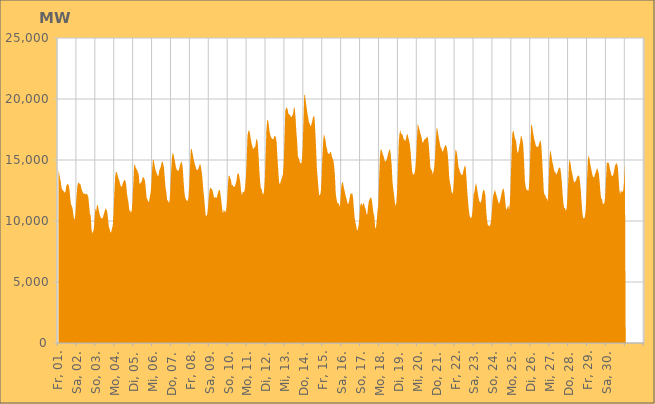
| Category | Series 0 |
|---|---|
|  Fr, 01.  | 14206.051 |
|  Fr, 01.  | 13898.54 |
|  Fr, 01.  | 13524.596 |
|  Fr, 01.  | 13199.623 |
|  Fr, 01.  | 12732.228 |
|  Fr, 01.  | 12575.21 |
|  Fr, 01.  | 12479.958 |
|  Fr, 01.  | 12425.705 |
|  Fr, 01.  | 12317.942 |
|  Fr, 01.  | 12392.595 |
|  Fr, 01.  | 12840.652 |
|  Fr, 01.  | 13028.688 |
|  Fr, 01.  | 13005.393 |
|  Fr, 01.  | 12953.041 |
|  Fr, 01.  | 12615.643 |
|  Fr, 01.  | 11912.754 |
|  Fr, 01.  | 11335.12 |
|  Sa, 02.  | 11243.42 |
|  Sa, 02.  | 11025.664 |
|  Sa, 02.  | 10510.777 |
|  Sa, 02.  | 10113.72 |
|  Sa, 02.  | 10259.37 |
|  Sa, 02.  | 10952.562 |
|  Sa, 02.  | 12005.603 |
|  Sa, 02.  | 12832.21 |
|  Sa, 02.  | 13135.107 |
|  Sa, 02.  | 13150.794 |
|  Sa, 02.  | 13036.995 |
|  Sa, 02.  | 13015.672 |
|  Sa, 02.  | 12733.287 |
|  Sa, 02.  | 12494.398 |
|  Sa, 02.  | 12358.996 |
|  Sa, 02.  | 12226.408 |
|  Sa, 02.  | 12256.556 |
|  Sa, 02.  | 12180.439 |
|  Sa, 02.  | 12204.571 |
|  Sa, 02.  | 12257.152 |
|  Sa, 02.  | 12134.843 |
|  Sa, 02.  | 11950.709 |
|  Sa, 02.  | 11250.667 |
|  Sa, 02.  | 10595.837 |
|  So, 03.  | 10470.053 |
|  So, 03.  | 9328.382 |
|  So, 03.  | 8987.927 |
|  So, 03.  | 9121.21 |
|  So, 03.  | 9351.886 |
|  So, 03.  | 10251.27 |
|  So, 03.  | 11045.456 |
|  So, 03.  | 10779.096 |
|  So, 03.  | 11344.207 |
|  So, 03.  | 11270.086 |
|  So, 03.  | 10972.944 |
|  So, 03.  | 10637.859 |
|  So, 03.  | 10394.919 |
|  So, 03.  | 10248.529 |
|  So, 03.  | 10213.805 |
|  So, 03.  | 10219.402 |
|  So, 03.  | 10424.769 |
|  So, 03.  | 10634.33 |
|  So, 03.  | 10867.056 |
|  So, 03.  | 11042.839 |
|  So, 03.  | 10928.629 |
|  So, 03.  | 10762.635 |
|  So, 03.  | 10172.294 |
|  So, 03.  | 9533.628 |
|  Mo, 04.  | 9350.665 |
|  Mo, 04.  | 9080.947 |
|  Mo, 04.  | 9078.856 |
|  Mo, 04.  | 9410.664 |
|  Mo, 04.  | 9592.637 |
|  Mo, 04.  | 10638.851 |
|  Mo, 04.  | 12307.908 |
|  Mo, 04.  | 13552.523 |
|  Mo, 04.  | 14026.66 |
|  Mo, 04.  | 14020.889 |
|  Mo, 04.  | 13797.84 |
|  Mo, 04.  | 13517.506 |
|  Mo, 04.  | 13401.262 |
|  Mo, 04.  | 13107.609 |
|  Mo, 04.  | 12873.319 |
|  Mo, 04.  | 12814.643 |
|  Mo, 04.  | 12889.637 |
|  Mo, 04.  | 13191.631 |
|  Mo, 04.  | 13248.834 |
|  Mo, 04.  | 13364.007 |
|  Mo, 04.  | 13331.704 |
|  Mo, 04.  | 12995.231 |
|  Mo, 04.  | 12264.385 |
|  Mo, 04.  | 11835.309 |
|  Di, 05.  | 11487.394 |
|  Di, 05.  | 10874.551 |
|  Di, 05.  | 10864.825 |
|  Di, 05.  | 10688.755 |
|  Di, 05.  | 10825.414 |
|  Di, 05.  | 11600.363 |
|  Di, 05.  | 12907.909 |
|  Di, 05.  | 14474.789 |
|  Di, 05.  | 14675.454 |
|  Di, 05.  | 14391.939 |
|  Di, 05.  | 14252.791 |
|  Di, 05.  | 14185.047 |
|  Di, 05.  | 13947.563 |
|  Di, 05.  | 13836.455 |
|  Di, 05.  | 13027.003 |
|  Di, 05.  | 13094.088 |
|  Di, 05.  | 13162.027 |
|  Di, 05.  | 13322.48 |
|  Di, 05.  | 13561.113 |
|  Di, 05.  | 13606.327 |
|  Di, 05.  | 13472.17 |
|  Di, 05.  | 13273.701 |
|  Di, 05.  | 12561.321 |
|  Di, 05.  | 11909.867 |
|  Mi, 06.  | 11768.25 |
|  Mi, 06.  | 11576.035 |
|  Mi, 06.  | 11589.949 |
|  Mi, 06.  | 11956.907 |
|  Mi, 06.  | 12294.291 |
|  Mi, 06.  | 13074.343 |
|  Mi, 06.  | 14232.596 |
|  Mi, 06.  | 15055.646 |
|  Mi, 06.  | 14973.45 |
|  Mi, 06.  | 14584.961 |
|  Mi, 06.  | 14257.167 |
|  Mi, 06.  | 14042.216 |
|  Mi, 06.  | 13870.75 |
|  Mi, 06.  | 13701.636 |
|  Mi, 06.  | 13702.376 |
|  Mi, 06.  | 14144.88 |
|  Mi, 06.  | 14287.904 |
|  Mi, 06.  | 14451.086 |
|  Mi, 06.  | 14784.713 |
|  Mi, 06.  | 14895.878 |
|  Mi, 06.  | 14687.911 |
|  Mi, 06.  | 14373.372 |
|  Mi, 06.  | 13541.577 |
|  Mi, 06.  | 12740.655 |
|  Do, 07.  | 12383.187 |
|  Do, 07.  | 11676.686 |
|  Do, 07.  | 11714.906 |
|  Do, 07.  | 11489.28 |
|  Do, 07.  | 11573.614 |
|  Do, 07.  | 12477.417 |
|  Do, 07.  | 13890.114 |
|  Do, 07.  | 15122.87 |
|  Do, 07.  | 15595.339 |
|  Do, 07.  | 15476.857 |
|  Do, 07.  | 15157.253 |
|  Do, 07.  | 14859.736 |
|  Do, 07.  | 14452.036 |
|  Do, 07.  | 14225.45 |
|  Do, 07.  | 14143.567 |
|  Do, 07.  | 14140.405 |
|  Do, 07.  | 14165.702 |
|  Do, 07.  | 14482.812 |
|  Do, 07.  | 14680.517 |
|  Do, 07.  | 14893.882 |
|  Do, 07.  | 14719.253 |
|  Do, 07.  | 14183.542 |
|  Do, 07.  | 13138.059 |
|  Do, 07.  | 12300.085 |
|  Fr, 08.  | 11913.491 |
|  Fr, 08.  | 11748.238 |
|  Fr, 08.  | 11670.884 |
|  Fr, 08.  | 11632.396 |
|  Fr, 08.  | 11896.291 |
|  Fr, 08.  | 12812.306 |
|  Fr, 08.  | 14328.753 |
|  Fr, 08.  | 15818.422 |
|  Fr, 08.  | 15954.343 |
|  Fr, 08.  | 15625.807 |
|  Fr, 08.  | 15268.075 |
|  Fr, 08.  | 14989.449 |
|  Fr, 08.  | 14680.382 |
|  Fr, 08.  | 14492.148 |
|  Fr, 08.  | 14233.564 |
|  Fr, 08.  | 14185.385 |
|  Fr, 08.  | 14194.205 |
|  Fr, 08.  | 14367.099 |
|  Fr, 08.  | 14578.973 |
|  Fr, 08.  | 14695.78 |
|  Fr, 08.  | 14383.202 |
|  Fr, 08.  | 13996.387 |
|  Fr, 08.  | 13352.292 |
|  Fr, 08.  | 12469.064 |
|  Sa, 09.  | 11889.752 |
|  Sa, 09.  | 11133.941 |
|  Sa, 09.  | 10399.812 |
|  Sa, 09.  | 10425.381 |
|  Sa, 09.  | 10563.251 |
|  Sa, 09.  | 11219.383 |
|  Sa, 09.  | 12026.362 |
|  Sa, 09.  | 12565.53 |
|  Sa, 09.  | 12745.648 |
|  Sa, 09.  | 12654.006 |
|  Sa, 09.  | 12609.409 |
|  Sa, 09.  | 12396.417 |
|  Sa, 09.  | 12074.853 |
|  Sa, 09.  | 11879.501 |
|  Sa, 09.  | 11942.247 |
|  Sa, 09.  | 11921.655 |
|  Sa, 09.  | 11899.793 |
|  Sa, 09.  | 12196.129 |
|  Sa, 09.  | 12410.26 |
|  Sa, 09.  | 12536.572 |
|  Sa, 09.  | 12521.517 |
|  Sa, 09.  | 12050.539 |
|  Sa, 09.  | 11522.445 |
|  Sa, 09.  | 10857.208 |
|  So, 10.  | 10633.791 |
|  So, 10.  | 10960.236 |
|  So, 10.  | 10768.791 |
|  So, 10.  | 10743.495 |
|  So, 10.  | 10908.038 |
|  So, 10.  | 11624.675 |
|  So, 10.  | 12783.029 |
|  So, 10.  | 13671.524 |
|  So, 10.  | 13732.509 |
|  So, 10.  | 13521.214 |
|  So, 10.  | 13350.705 |
|  So, 10.  | 12912.219 |
|  So, 10.  | 12962.944 |
|  So, 10.  | 12842.856 |
|  So, 10.  | 12777.029 |
|  So, 10.  | 12850.332 |
|  So, 10.  | 13040.249 |
|  So, 10.  | 13324.922 |
|  So, 10.  | 13793.408 |
|  So, 10.  | 13913.025 |
|  So, 10.  | 13871.282 |
|  So, 10.  | 13503.177 |
|  So, 10.  | 13053.056 |
|  So, 10.  | 12385.698 |
|  Mo, 11.  | 12098.429 |
|  Mo, 11.  | 12435.155 |
|  Mo, 11.  | 12357.357 |
|  Mo, 11.  | 12424.213 |
|  Mo, 11.  | 12817.484 |
|  Mo, 11.  | 13599.244 |
|  Mo, 11.  | 15116.304 |
|  Mo, 11.  | 16978.296 |
|  Mo, 11.  | 17358.862 |
|  Mo, 11.  | 17437.573 |
|  Mo, 11.  | 17205.193 |
|  Mo, 11.  | 16787.847 |
|  Mo, 11.  | 16403.98 |
|  Mo, 11.  | 16170.717 |
|  Mo, 11.  | 15904.078 |
|  Mo, 11.  | 15944.777 |
|  Mo, 11.  | 16057.05 |
|  Mo, 11.  | 16125.807 |
|  Mo, 11.  | 16631.586 |
|  Mo, 11.  | 16742.349 |
|  Mo, 11.  | 16415.961 |
|  Mo, 11.  | 15412.886 |
|  Mo, 11.  | 14183.733 |
|  Mo, 11.  | 13206.851 |
|  Di, 12.  | 12649.65 |
|  Di, 12.  | 12641.761 |
|  Di, 12.  | 12249.537 |
|  Di, 12.  | 12160.892 |
|  Di, 12.  | 12472.026 |
|  Di, 12.  | 13407.375 |
|  Di, 12.  | 15422.606 |
|  Di, 12.  | 17436.58 |
|  Di, 12.  | 18247.563 |
|  Di, 12.  | 18276.497 |
|  Di, 12.  | 17913.568 |
|  Di, 12.  | 17330.765 |
|  Di, 12.  | 17030.102 |
|  Di, 12.  | 16853.199 |
|  Di, 12.  | 16754.457 |
|  Di, 12.  | 16708.768 |
|  Di, 12.  | 16689.458 |
|  Di, 12.  | 16965.502 |
|  Di, 12.  | 16976.23 |
|  Di, 12.  | 16849.074 |
|  Di, 12.  | 16439.112 |
|  Di, 12.  | 15193.727 |
|  Di, 12.  | 14206.584 |
|  Di, 12.  | 13215.647 |
|  Mi, 13.  | 12991.597 |
|  Mi, 13.  | 13200.007 |
|  Mi, 13.  | 13423.641 |
|  Mi, 13.  | 13608.225 |
|  Mi, 13.  | 13842.494 |
|  Mi, 13.  | 14777.578 |
|  Mi, 13.  | 16772.264 |
|  Mi, 13.  | 19048.754 |
|  Mi, 13.  | 19245.695 |
|  Mi, 13.  | 19322.712 |
|  Mi, 13.  | 19115.128 |
|  Mi, 13.  | 18775.688 |
|  Mi, 13.  | 18737.073 |
|  Mi, 13.  | 18667.921 |
|  Mi, 13.  | 18560.371 |
|  Mi, 13.  | 18515.381 |
|  Mi, 13.  | 18660.123 |
|  Mi, 13.  | 18835.086 |
|  Mi, 13.  | 19318.502 |
|  Mi, 13.  | 19259.519 |
|  Mi, 13.  | 18457.232 |
|  Mi, 13.  | 17323.522 |
|  Mi, 13.  | 16518.752 |
|  Mi, 13.  | 15271.801 |
|  Do, 14.  | 15167.062 |
|  Do, 14.  | 14926.311 |
|  Do, 14.  | 14760.325 |
|  Do, 14.  | 14701.055 |
|  Do, 14.  | 14941.574 |
|  Do, 14.  | 16049.893 |
|  Do, 14.  | 18096.161 |
|  Do, 14.  | 20327.972 |
|  Do, 14.  | 20347.413 |
|  Do, 14.  | 19747.275 |
|  Do, 14.  | 19345.442 |
|  Do, 14.  | 18847.858 |
|  Do, 14.  | 18481.454 |
|  Do, 14.  | 18062.716 |
|  Do, 14.  | 17989.557 |
|  Do, 14.  | 17744.442 |
|  Do, 14.  | 17890.493 |
|  Do, 14.  | 18138.594 |
|  Do, 14.  | 18440.364 |
|  Do, 14.  | 18608.004 |
|  Do, 14.  | 18521.047 |
|  Do, 14.  | 17408.014 |
|  Do, 14.  | 16048.173 |
|  Do, 14.  | 14394.803 |
|  Fr, 15.  | 13566.551 |
|  Fr, 15.  | 12728.914 |
|  Fr, 15.  | 12108.626 |
|  Fr, 15.  | 12132.649 |
|  Fr, 15.  | 12342.689 |
|  Fr, 15.  | 13495.882 |
|  Fr, 15.  | 15178.928 |
|  Fr, 15.  | 16522.035 |
|  Fr, 15.  | 17104.605 |
|  Fr, 15.  | 16912.337 |
|  Fr, 15.  | 16610.434 |
|  Fr, 15.  | 16118.079 |
|  Fr, 15.  | 15879.914 |
|  Fr, 15.  | 15560.034 |
|  Fr, 15.  | 15512.961 |
|  Fr, 15.  | 15487.722 |
|  Fr, 15.  | 15675.508 |
|  Fr, 15.  | 15635.526 |
|  Fr, 15.  | 15282.533 |
|  Fr, 15.  | 15122.525 |
|  Fr, 15.  | 14962.51 |
|  Fr, 15.  | 14507.531 |
|  Fr, 15.  | 13698.31 |
|  Fr, 15.  | 12239.324 |
|  Sa, 16.  | 11809.537 |
|  Sa, 16.  | 11487.672 |
|  Sa, 16.  | 11427.556 |
|  Sa, 16.  | 11444.578 |
|  Sa, 16.  | 11118.907 |
|  Sa, 16.  | 11674.318 |
|  Sa, 16.  | 12783.065 |
|  Sa, 16.  | 13160.67 |
|  Sa, 16.  | 13179.924 |
|  Sa, 16.  | 12828.3 |
|  Sa, 16.  | 12546.705 |
|  Sa, 16.  | 12229.859 |
|  Sa, 16.  | 11944.699 |
|  Sa, 16.  | 11741.123 |
|  Sa, 16.  | 11424.687 |
|  Sa, 16.  | 11400.009 |
|  Sa, 16.  | 11647.776 |
|  Sa, 16.  | 12006.161 |
|  Sa, 16.  | 12275.518 |
|  Sa, 16.  | 12237.044 |
|  Sa, 16.  | 12273.566 |
|  Sa, 16.  | 11882.938 |
|  Sa, 16.  | 11054.716 |
|  Sa, 16.  | 10253.817 |
|  So, 17.  | 9873.705 |
|  So, 17.  | 9604.314 |
|  So, 17.  | 9188.61 |
|  So, 17.  | 9333.907 |
|  So, 17.  | 9620.327 |
|  So, 17.  | 10258.011 |
|  So, 17.  | 11218.727 |
|  So, 17.  | 11457.784 |
|  So, 17.  | 11404.816 |
|  So, 17.  | 11220.641 |
|  So, 17.  | 11497.404 |
|  So, 17.  | 11394.522 |
|  So, 17.  | 11114.002 |
|  So, 17.  | 10976.852 |
|  So, 17.  | 10581.387 |
|  So, 17.  | 10521.506 |
|  So, 17.  | 11190.195 |
|  So, 17.  | 11629.09 |
|  So, 17.  | 11765.556 |
|  So, 17.  | 11932.045 |
|  So, 17.  | 11908.558 |
|  So, 17.  | 11648.93 |
|  So, 17.  | 11071.439 |
|  So, 17.  | 10621.473 |
|  Mo, 18.  | 10345.637 |
|  Mo, 18.  | 9521.877 |
|  Mo, 18.  | 9361.529 |
|  Mo, 18.  | 9998.717 |
|  Mo, 18.  | 10817.322 |
|  Mo, 18.  | 11284.44 |
|  Mo, 18.  | 13411.031 |
|  Mo, 18.  | 15189.964 |
|  Mo, 18.  | 15861.353 |
|  Mo, 18.  | 15853.465 |
|  Mo, 18.  | 15638.302 |
|  Mo, 18.  | 15420.353 |
|  Mo, 18.  | 15250.681 |
|  Mo, 18.  | 14966.474 |
|  Mo, 18.  | 14862.574 |
|  Mo, 18.  | 14949.468 |
|  Mo, 18.  | 15099.225 |
|  Mo, 18.  | 15384.202 |
|  Mo, 18.  | 15643.399 |
|  Mo, 18.  | 15822.148 |
|  Mo, 18.  | 15878.954 |
|  Mo, 18.  | 15292.118 |
|  Mo, 18.  | 14572.013 |
|  Mo, 18.  | 13206.512 |
|  Di, 19.  | 12648.579 |
|  Di, 19.  | 12141.995 |
|  Di, 19.  | 11541.646 |
|  Di, 19.  | 11234 |
|  Di, 19.  | 11537.331 |
|  Di, 19.  | 12621.761 |
|  Di, 19.  | 14342.096 |
|  Di, 19.  | 16550.505 |
|  Di, 19.  | 17193.767 |
|  Di, 19.  | 17470.897 |
|  Di, 19.  | 17094.739 |
|  Di, 19.  | 17173.27 |
|  Di, 19.  | 17024.347 |
|  Di, 19.  | 16734.553 |
|  Di, 19.  | 16688.89 |
|  Di, 19.  | 16541.897 |
|  Di, 19.  | 16687.563 |
|  Di, 19.  | 17037.442 |
|  Di, 19.  | 17142.542 |
|  Di, 19.  | 16881.433 |
|  Di, 19.  | 16606.377 |
|  Di, 19.  | 16311.054 |
|  Di, 19.  | 15684.334 |
|  Di, 19.  | 14802.419 |
|  Mi, 20.  | 14087.576 |
|  Mi, 20.  | 13794.76 |
|  Mi, 20.  | 13819.366 |
|  Mi, 20.  | 13916.518 |
|  Mi, 20.  | 14294.67 |
|  Mi, 20.  | 15165.618 |
|  Mi, 20.  | 16631.791 |
|  Mi, 20.  | 17978.054 |
|  Mi, 20.  | 17776.068 |
|  Mi, 20.  | 17572.383 |
|  Mi, 20.  | 17286.177 |
|  Mi, 20.  | 17064.329 |
|  Mi, 20.  | 16796.447 |
|  Mi, 20.  | 16424.868 |
|  Mi, 20.  | 16464.18 |
|  Mi, 20.  | 16614.682 |
|  Mi, 20.  | 16709.364 |
|  Mi, 20.  | 16736.566 |
|  Mi, 20.  | 16811.145 |
|  Mi, 20.  | 16920.288 |
|  Mi, 20.  | 16810.908 |
|  Mi, 20.  | 16267.065 |
|  Mi, 20.  | 15443.34 |
|  Mi, 20.  | 14467 |
|  Do, 21.  | 14186.118 |
|  Do, 21.  | 14173.271 |
|  Do, 21.  | 13828.444 |
|  Do, 21.  | 14025.66 |
|  Do, 21.  | 14384.608 |
|  Do, 21.  | 15180.031 |
|  Do, 21.  | 16538.235 |
|  Do, 21.  | 17596.779 |
|  Do, 21.  | 17559.6 |
|  Do, 21.  | 17126.149 |
|  Do, 21.  | 16737.399 |
|  Do, 21.  | 16398.759 |
|  Do, 21.  | 16048.157 |
|  Do, 21.  | 15984.637 |
|  Do, 21.  | 15763.855 |
|  Do, 21.  | 15658.544 |
|  Do, 21.  | 15885.391 |
|  Do, 21.  | 16036.217 |
|  Do, 21.  | 16216.771 |
|  Do, 21.  | 16217.124 |
|  Do, 21.  | 16006.369 |
|  Do, 21.  | 15559.346 |
|  Do, 21.  | 14787.029 |
|  Do, 21.  | 13597.793 |
|  Fr, 22.  | 13137.78 |
|  Fr, 22.  | 12851.653 |
|  Fr, 22.  | 12391.077 |
|  Fr, 22.  | 12197.533 |
|  Fr, 22.  | 12461.922 |
|  Fr, 22.  | 13345.986 |
|  Fr, 22.  | 14889.897 |
|  Fr, 22.  | 15871.458 |
|  Fr, 22.  | 15773.725 |
|  Fr, 22.  | 15454.17 |
|  Fr, 22.  | 14887.316 |
|  Fr, 22.  | 14375.973 |
|  Fr, 22.  | 14208.647 |
|  Fr, 22.  | 13940.697 |
|  Fr, 22.  | 13871.063 |
|  Fr, 22.  | 13746.127 |
|  Fr, 22.  | 13796.97 |
|  Fr, 22.  | 14130.459 |
|  Fr, 22.  | 14387.658 |
|  Fr, 22.  | 14571.786 |
|  Fr, 22.  | 14341.17 |
|  Fr, 22.  | 13414.442 |
|  Fr, 22.  | 12362.179 |
|  Fr, 22.  | 11563.697 |
|  Sa, 23.  | 10833.193 |
|  Sa, 23.  | 10396.089 |
|  Sa, 23.  | 10269.076 |
|  Sa, 23.  | 10229.453 |
|  Sa, 23.  | 10506.113 |
|  Sa, 23.  | 11154.387 |
|  Sa, 23.  | 12186.276 |
|  Sa, 23.  | 12360.416 |
|  Sa, 23.  | 12820.331 |
|  Sa, 23.  | 13122.199 |
|  Sa, 23.  | 12808.064 |
|  Sa, 23.  | 12379.625 |
|  Sa, 23.  | 12004.669 |
|  Sa, 23.  | 11654.255 |
|  Sa, 23.  | 11553.428 |
|  Sa, 23.  | 11496.803 |
|  Sa, 23.  | 11741.475 |
|  Sa, 23.  | 12229.631 |
|  Sa, 23.  | 12473.724 |
|  Sa, 23.  | 12575.075 |
|  Sa, 23.  | 12407.167 |
|  Sa, 23.  | 12058.481 |
|  Sa, 23.  | 10792.418 |
|  Sa, 23.  | 10090.858 |
|  So, 24.  | 9670.434 |
|  So, 24.  | 9630.616 |
|  So, 24.  | 9569.115 |
|  So, 24.  | 9657.45 |
|  So, 24.  | 9952.908 |
|  So, 24.  | 10664.763 |
|  So, 24.  | 11595.299 |
|  So, 24.  | 12121.878 |
|  So, 24.  | 12324.456 |
|  So, 24.  | 12560.615 |
|  So, 24.  | 12340.512 |
|  So, 24.  | 12105.914 |
|  So, 24.  | 11877.678 |
|  So, 24.  | 11654.086 |
|  So, 24.  | 11395.527 |
|  So, 24.  | 11519.563 |
|  So, 24.  | 11756.759 |
|  So, 24.  | 12118.309 |
|  So, 24.  | 12403.495 |
|  So, 24.  | 12611.257 |
|  So, 24.  | 12667.781 |
|  So, 24.  | 12324.021 |
|  So, 24.  | 11752.733 |
|  So, 24.  | 11040.544 |
|  Mo, 25.  | 10907.549 |
|  Mo, 25.  | 11141.916 |
|  Mo, 25.  | 11284.734 |
|  Mo, 25.  | 10904.525 |
|  Mo, 25.  | 11505.885 |
|  Mo, 25.  | 13149.536 |
|  Mo, 25.  | 15144.465 |
|  Mo, 25.  | 17108.848 |
|  Mo, 25.  | 17402.278 |
|  Mo, 25.  | 17289.59 |
|  Mo, 25.  | 16890.956 |
|  Mo, 25.  | 16692.156 |
|  Mo, 25.  | 16522.128 |
|  Mo, 25.  | 15802.62 |
|  Mo, 25.  | 15547.022 |
|  Mo, 25.  | 15751.873 |
|  Mo, 25.  | 16179.873 |
|  Mo, 25.  | 16448.687 |
|  Mo, 25.  | 16992.653 |
|  Mo, 25.  | 16897.996 |
|  Mo, 25.  | 16632.207 |
|  Mo, 25.  | 16182.484 |
|  Mo, 25.  | 14932.351 |
|  Mo, 25.  | 13338.307 |
|  Di, 26.  | 12840.281 |
|  Di, 26.  | 12544.642 |
|  Di, 26.  | 12596.445 |
|  Di, 26.  | 12430.059 |
|  Di, 26.  | 12617.141 |
|  Di, 26.  | 13638.739 |
|  Di, 26.  | 15698.693 |
|  Di, 26.  | 17827.77 |
|  Di, 26.  | 17916.026 |
|  Di, 26.  | 17415.551 |
|  Di, 26.  | 17023.988 |
|  Di, 26.  | 16684.944 |
|  Di, 26.  | 16451.663 |
|  Di, 26.  | 16163.654 |
|  Di, 26.  | 16082.046 |
|  Di, 26.  | 16073.214 |
|  Di, 26.  | 16083.809 |
|  Di, 26.  | 16303.578 |
|  Di, 26.  | 16516.632 |
|  Di, 26.  | 16623.937 |
|  Di, 26.  | 16115.798 |
|  Di, 26.  | 15007.075 |
|  Di, 26.  | 13796.044 |
|  Di, 26.  | 12499.409 |
|  Mi, 27.  | 12132.985 |
|  Mi, 27.  | 12141.828 |
|  Mi, 27.  | 11825.913 |
|  Mi, 27.  | 11876.937 |
|  Mi, 27.  | 11585.101 |
|  Mi, 27.  | 12632.953 |
|  Mi, 27.  | 14724.38 |
|  Mi, 27.  | 15769.066 |
|  Mi, 27.  | 15662.712 |
|  Mi, 27.  | 15251.529 |
|  Mi, 27.  | 14801.665 |
|  Mi, 27.  | 14573.194 |
|  Mi, 27.  | 14185.295 |
|  Mi, 27.  | 14024.434 |
|  Mi, 27.  | 13963.179 |
|  Mi, 27.  | 13798.442 |
|  Mi, 27.  | 13934.199 |
|  Mi, 27.  | 14140.626 |
|  Mi, 27.  | 14324.213 |
|  Mi, 27.  | 14388.317 |
|  Mi, 27.  | 14327.446 |
|  Mi, 27.  | 13839.352 |
|  Mi, 27.  | 13156.319 |
|  Mi, 27.  | 12151.636 |
|  Do, 28.  | 11436.24 |
|  Do, 28.  | 11071.444 |
|  Do, 28.  | 11062.166 |
|  Do, 28.  | 10826.843 |
|  Do, 28.  | 11018.908 |
|  Do, 28.  | 11851.927 |
|  Do, 28.  | 13150.084 |
|  Do, 28.  | 14756.319 |
|  Do, 28.  | 15024.901 |
|  Do, 28.  | 14706.805 |
|  Do, 28.  | 14221.595 |
|  Do, 28.  | 13908.05 |
|  Do, 28.  | 13616.44 |
|  Do, 28.  | 13272.055 |
|  Do, 28.  | 13136.148 |
|  Do, 28.  | 13253.075 |
|  Do, 28.  | 13307.624 |
|  Do, 28.  | 13578.057 |
|  Do, 28.  | 13679.057 |
|  Do, 28.  | 13736.466 |
|  Do, 28.  | 13693.946 |
|  Do, 28.  | 13206.184 |
|  Do, 28.  | 12527.714 |
|  Do, 28.  | 11543.252 |
|  Fr, 29.  | 10677.221 |
|  Fr, 29.  | 10247.561 |
|  Fr, 29.  | 10231.693 |
|  Fr, 29.  | 10270.258 |
|  Fr, 29.  | 10741.384 |
|  Fr, 29.  | 11880.301 |
|  Fr, 29.  | 13511.394 |
|  Fr, 29.  | 15029.819 |
|  Fr, 29.  | 15387.173 |
|  Fr, 29.  | 15112.839 |
|  Fr, 29.  | 14653.072 |
|  Fr, 29.  | 14335.405 |
|  Fr, 29.  | 14016.186 |
|  Fr, 29.  | 13732.285 |
|  Fr, 29.  | 13580.543 |
|  Fr, 29.  | 13583.999 |
|  Fr, 29.  | 13835.512 |
|  Fr, 29.  | 13985.631 |
|  Fr, 29.  | 14208.056 |
|  Fr, 29.  | 14330.561 |
|  Fr, 29.  | 14090.051 |
|  Fr, 29.  | 13850.863 |
|  Fr, 29.  | 13147.442 |
|  Fr, 29.  | 12280.55 |
|  Sa, 30.  | 11827.301 |
|  Sa, 30.  | 11799.659 |
|  Sa, 30.  | 11367.948 |
|  Sa, 30.  | 11419.544 |
|  Sa, 30.  | 11480.913 |
|  Sa, 30.  | 12004.777 |
|  Sa, 30.  | 13327.552 |
|  Sa, 30.  | 14803.572 |
|  Sa, 30.  | 14770.597 |
|  Sa, 30.  | 14788.964 |
|  Sa, 30.  | 14654.274 |
|  Sa, 30.  | 14249.573 |
|  Sa, 30.  | 14015.229 |
|  Sa, 30.  | 13717.769 |
|  Sa, 30.  | 13691.052 |
|  Sa, 30.  | 13730.002 |
|  Sa, 30.  | 14037.881 |
|  Sa, 30.  | 14395.595 |
|  Sa, 30.  | 14612.759 |
|  Sa, 30.  | 14755.228 |
|  Sa, 30.  | 14662.753 |
|  Sa, 30.  | 14442.302 |
|  Sa, 30.  | 13506.994 |
|  Sa, 30.  | 12525.311 |
|  So, 01.  | 12183.834 |
|  So, 01.  | 12511.836 |
|  So, 01.  | 12410.859 |
|  So, 01.  | 12370.313 |
|  So, 01.  | 12567.223 |
|  So, 01.  | 13206.37 |
|    | 14560.931 |
|    | 0 |
|    | 0 |
|    | 0 |
|    | 0 |
|    | 0 |
|    | 0 |
|    | 0 |
|    | 0 |
|    | 0 |
|    | 0 |
|    | 0 |
|    | 0 |
|    | 0 |
|    | 0 |
|    | 0 |
|    | 0 |
|    | 0 |
|    | 0 |
|    | 0 |
|    | 0 |
|    | 0 |
|    | 0 |
|    | 0 |